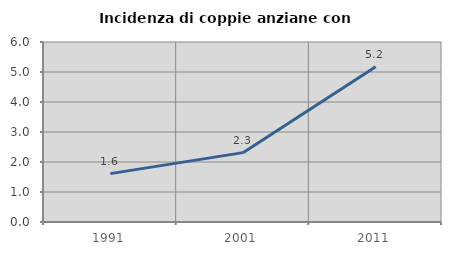
| Category | Incidenza di coppie anziane con figli |
|---|---|
| 1991.0 | 1.613 |
| 2001.0 | 2.312 |
| 2011.0 | 5.172 |